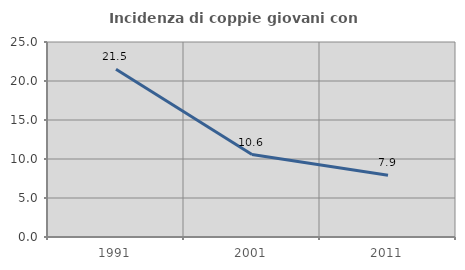
| Category | Incidenza di coppie giovani con figli |
|---|---|
| 1991.0 | 21.505 |
| 2001.0 | 10.577 |
| 2011.0 | 7.916 |